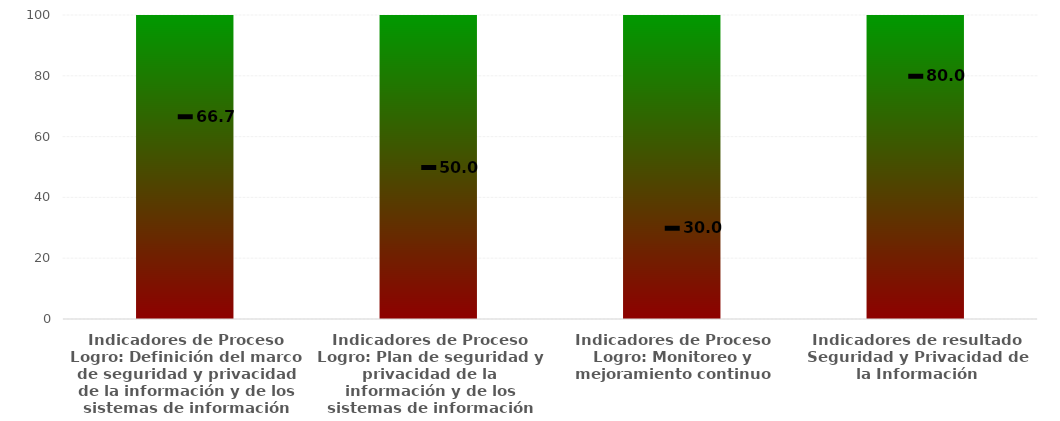
| Category | Series 0 |
|---|---|
| Indicadores de Proceso
Logro: Definición del marco de seguridad y privacidad de la información y de los sistemas de información | 100 |
| Indicadores de Proceso
Logro: Plan de seguridad y privacidad de la información y de los sistemas de información | 100 |
| Indicadores de Proceso Logro: Monitoreo y mejoramiento continuo | 100 |
| Indicadores de resultado Seguridad y Privacidad de la Información | 100 |